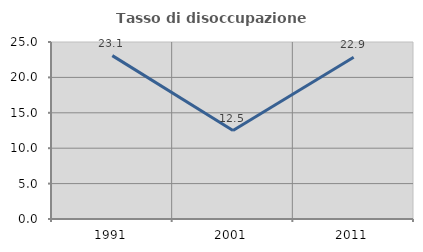
| Category | Tasso di disoccupazione giovanile  |
|---|---|
| 1991.0 | 23.077 |
| 2001.0 | 12.5 |
| 2011.0 | 22.857 |